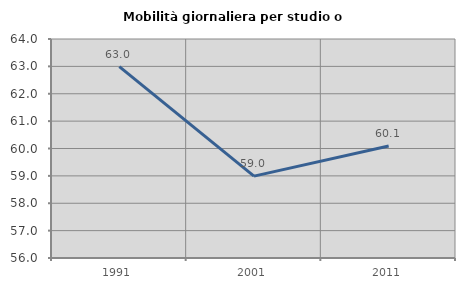
| Category | Mobilità giornaliera per studio o lavoro |
|---|---|
| 1991.0 | 62.99 |
| 2001.0 | 58.991 |
| 2011.0 | 60.09 |